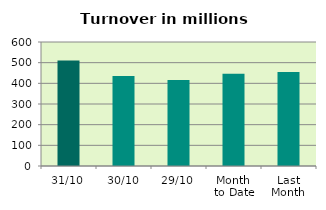
| Category | Series 0 |
|---|---|
| 31/10 | 510.559 |
| 30/10 | 435.263 |
| 29/10 | 415.913 |
| Month 
to Date | 446.481 |
| Last
Month | 454.566 |